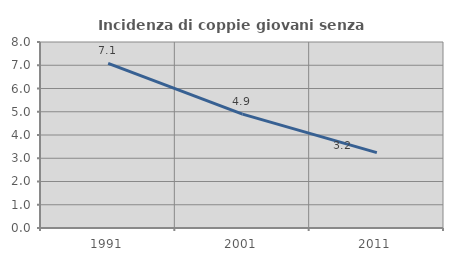
| Category | Incidenza di coppie giovani senza figli |
|---|---|
| 1991.0 | 7.083 |
| 2001.0 | 4.898 |
| 2011.0 | 3.243 |